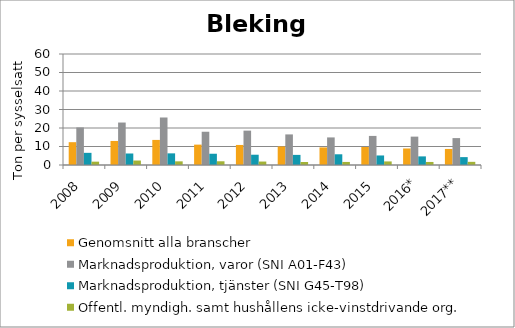
| Category | Genomsnitt alla branscher | Marknadsproduktion, varor (SNI A01-F43) | Marknadsproduktion, tjänster (SNI G45-T98) | Offentl. myndigh. samt hushållens icke-vinstdrivande org. |
|---|---|---|---|---|
| 2008 | 12.337 | 20.306 | 6.572 | 1.804 |
| 2009 | 12.997 | 22.957 | 6.221 | 2.41 |
| 2010 | 13.558 | 25.68 | 6.295 | 1.977 |
| 2011 | 11.009 | 17.977 | 6.087 | 2.013 |
| 2012 | 10.833 | 18.576 | 5.555 | 1.867 |
| 2013 | 10.016 | 16.535 | 5.469 | 1.607 |
| 2014 | 9.513 | 14.908 | 5.794 | 1.653 |
| 2015 | 9.721 | 15.719 | 5.152 | 1.935 |
| 2016* | 8.932 | 15.337 | 4.656 | 1.643 |
| 2017** | 8.676 | 14.545 | 4.26 | 1.709 |